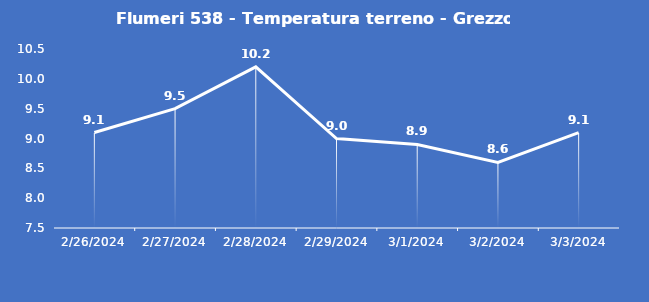
| Category | Flumeri 538 - Temperatura terreno - Grezzo (°C) |
|---|---|
| 2/26/24 | 9.1 |
| 2/27/24 | 9.5 |
| 2/28/24 | 10.2 |
| 2/29/24 | 9 |
| 3/1/24 | 8.9 |
| 3/2/24 | 8.6 |
| 3/3/24 | 9.1 |